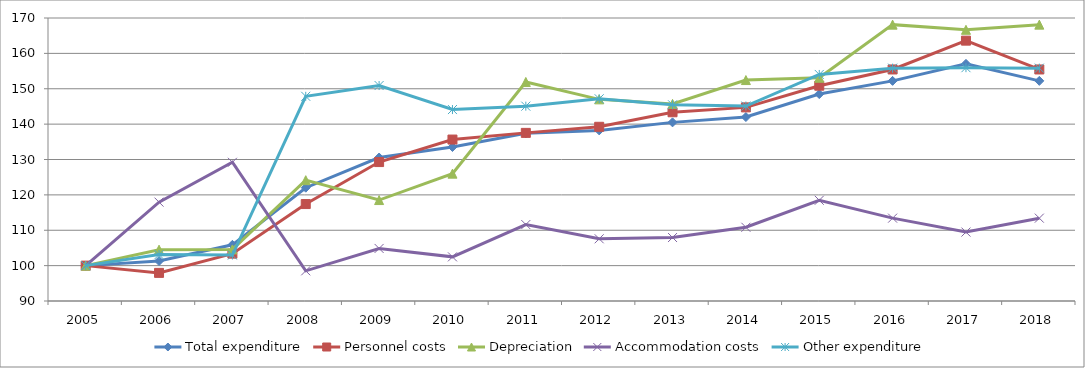
| Category | Total expenditure | Personnel costs | Depreciation | Accommodation costs | Other expenditure |
|---|---|---|---|---|---|
| 2005.0 | 100 | 100 | 100 | 100 | 100 |
| 2006.0 | 101.301 | 97.949 | 104.506 | 117.948 | 103.111 |
| 2007.0 | 105.876 | 103.387 | 104.584 | 129.213 | 102.991 |
| 2008.0 | 122.03 | 117.407 | 124.16 | 98.531 | 147.864 |
| 2009.0 | 130.557 | 129.274 | 118.537 | 104.856 | 150.913 |
| 2010.0 | 133.535 | 135.64 | 125.999 | 102.477 | 144.12 |
| 2011.0 | 137.387 | 137.525 | 151.917 | 111.609 | 145.079 |
| 2012.0 | 138.226 | 139.248 | 147.003 | 107.587 | 147.164 |
| 2013.0 | 140.495 | 143.356 | 145.723 | 107.943 | 145.466 |
| 2014.0 | 142 | 144.734 | 152.46 | 110.841 | 145.114 |
| 2015.0 | 148.497 | 150.859 | 153.115 | 118.473 | 154.039 |
| 2016.0 | 152.229 | 155.452 | 168.123 | 113.419 | 155.827 |
| 2017.0 | 157.039 | 163.599 | 166.664 | 109.487 | 155.956 |
| 2018.0 | 152.229 | 155.452 | 168.123 | 113.419 | 155.827 |